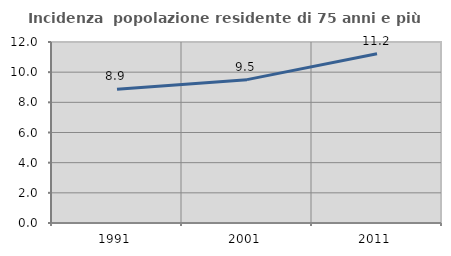
| Category | Incidenza  popolazione residente di 75 anni e più |
|---|---|
| 1991.0 | 8.863 |
| 2001.0 | 9.504 |
| 2011.0 | 11.221 |